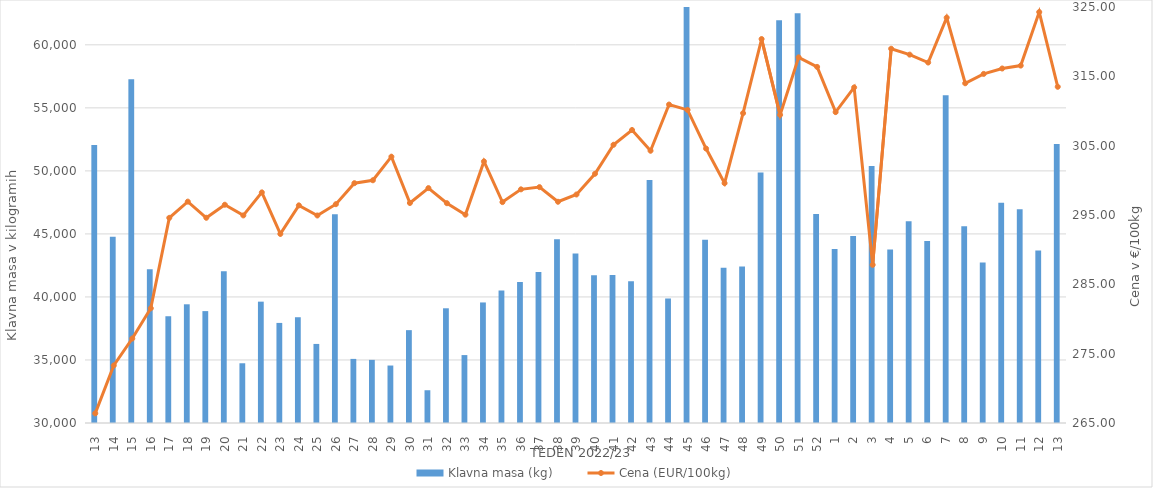
| Category | Klavna masa (kg) |
|---|---|
| 13.0 | 52061 |
| 14.0 | 44774 |
| 15.0 | 57268 |
| 16.0 | 42191 |
| 17.0 | 38469 |
| 18.0 | 39417 |
| 19.0 | 38876 |
| 20.0 | 42047 |
| 21.0 | 34739 |
| 22.0 | 39626 |
| 23.0 | 37939 |
| 24.0 | 38390 |
| 25.0 | 36272 |
| 26.0 | 46553 |
| 27.0 | 35085 |
| 28.0 | 35007 |
| 29.0 | 34559 |
| 30.0 | 37366 |
| 31.0 | 32599 |
| 32.0 | 39100 |
| 33.0 | 35388 |
| 34.0 | 39563 |
| 35.0 | 40507 |
| 36.0 | 41176 |
| 37.0 | 41983 |
| 38.0 | 44572 |
| 39.0 | 43447 |
| 40.0 | 41711 |
| 41.0 | 41736 |
| 42.0 | 41239 |
| 43.0 | 49284 |
| 44.0 | 39877 |
| 45.0 | 63668 |
| 46.0 | 44528 |
| 47.0 | 42319 |
| 48.0 | 42416 |
| 49.0 | 49873 |
| 50.0 | 61942 |
| 51.0 | 62514 |
| 52.0 | 46589 |
| 1.0 | 43807 |
| 2.0 | 44834 |
| 3.0 | 50386 |
| 4.0 | 43773 |
| 5.0 | 46011 |
| 6.0 | 44439 |
| 7.0 | 56001 |
| 8.0 | 45613 |
| 9.0 | 42730 |
| 10.0 | 47471 |
| 11.0 | 46952 |
| 12.0 | 43683 |
| 13.0 | 52135 |